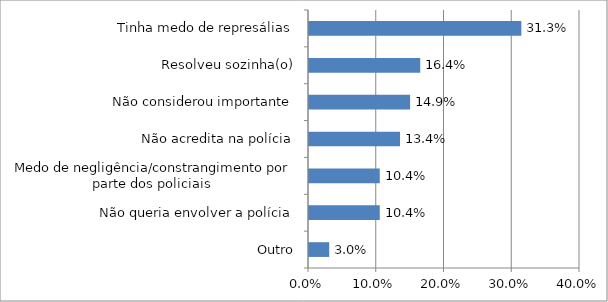
| Category | Series 0 |
|---|---|
| Outro | 0.03 |
| Não queria envolver a polícia | 0.104 |
| Medo de negligência/constrangimento por parte dos policiais  | 0.104 |
| Não acredita na polícia | 0.134 |
| Não considerou importante | 0.149 |
| Resolveu sozinha(o) | 0.164 |
| Tinha medo de represálias | 0.313 |